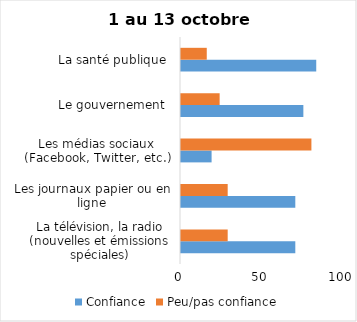
| Category | Confiance | Peu/pas confiance |
|---|---|---|
| La télévision, la radio (nouvelles et émissions spéciales) | 71 | 29 |
| Les journaux papier ou en ligne | 71 | 29 |
| Les médias sociaux (Facebook, Twitter, etc.) | 19 | 81 |
| Le gouvernement  | 76 | 24 |
| La santé publique  | 84 | 16 |